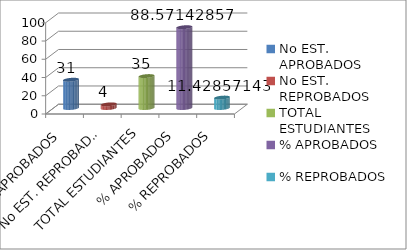
| Category | Series 0 |
|---|---|
| No EST. APROBADOS | 31 |
| No EST. REPROBADOS | 4 |
| TOTAL ESTUDIANTES | 35 |
| % APROBADOS | 88.571 |
| % REPROBADOS | 11.429 |